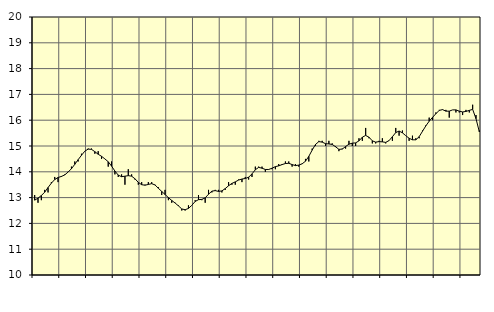
| Category | Piggar | Vård och omsorg, SNI 86-88 |
|---|---|---|
| nan | 13.1 | 12.9 |
| 87.0 | 12.8 | 12.98 |
| 87.0 | 12.9 | 13.08 |
| 87.0 | 13.3 | 13.21 |
| nan | 13.2 | 13.39 |
| 88.0 | 13.6 | 13.56 |
| 88.0 | 13.8 | 13.7 |
| 88.0 | 13.6 | 13.78 |
| nan | 13.8 | 13.82 |
| 89.0 | 13.9 | 13.88 |
| 89.0 | 14 | 13.99 |
| 89.0 | 14.2 | 14.12 |
| nan | 14.4 | 14.29 |
| 90.0 | 14.4 | 14.47 |
| 90.0 | 14.7 | 14.64 |
| 90.0 | 14.8 | 14.8 |
| nan | 14.9 | 14.88 |
| 91.0 | 14.9 | 14.87 |
| 91.0 | 14.7 | 14.78 |
| 91.0 | 14.8 | 14.68 |
| nan | 14.5 | 14.6 |
| 92.0 | 14.5 | 14.5 |
| 92.0 | 14.2 | 14.39 |
| 92.0 | 14.4 | 14.22 |
| nan | 13.9 | 14.03 |
| 93.0 | 13.8 | 13.87 |
| 93.0 | 13.9 | 13.81 |
| 93.0 | 13.5 | 13.83 |
| nan | 14.1 | 13.85 |
| 94.0 | 13.9 | 13.83 |
| 94.0 | 13.7 | 13.73 |
| 94.0 | 13.5 | 13.59 |
| nan | 13.6 | 13.5 |
| 95.0 | 13.5 | 13.48 |
| 95.0 | 13.6 | 13.51 |
| 95.0 | 13.6 | 13.54 |
| nan | 13.5 | 13.49 |
| 96.0 | 13.4 | 13.36 |
| 96.0 | 13.1 | 13.24 |
| 96.0 | 13.3 | 13.12 |
| nan | 12.9 | 13 |
| 97.0 | 12.8 | 12.89 |
| 97.0 | 12.8 | 12.79 |
| 97.0 | 12.7 | 12.68 |
| nan | 12.5 | 12.56 |
| 98.0 | 12.5 | 12.53 |
| 98.0 | 12.7 | 12.58 |
| 98.0 | 12.7 | 12.7 |
| nan | 12.9 | 12.85 |
| 99.0 | 13.1 | 12.92 |
| 99.0 | 12.9 | 12.93 |
| 99.0 | 12.8 | 12.99 |
| nan | 13.3 | 13.13 |
| 0.0 | 13.2 | 13.25 |
| 0.0 | 13.3 | 13.27 |
| 0.0 | 13.3 | 13.24 |
| nan | 13.2 | 13.26 |
| 1.0 | 13.3 | 13.35 |
| 1.0 | 13.6 | 13.46 |
| 1.0 | 13.5 | 13.55 |
| nan | 13.5 | 13.61 |
| 2.0 | 13.7 | 13.68 |
| 2.0 | 13.6 | 13.72 |
| 2.0 | 13.8 | 13.74 |
| nan | 13.7 | 13.79 |
| 3.0 | 13.8 | 13.92 |
| 3.0 | 14.2 | 14.08 |
| 3.0 | 14.2 | 14.17 |
| nan | 14.2 | 14.14 |
| 4.0 | 14 | 14.09 |
| 4.0 | 14.1 | 14.09 |
| 4.0 | 14.1 | 14.14 |
| nan | 14.1 | 14.2 |
| 5.0 | 14.3 | 14.23 |
| 5.0 | 14.3 | 14.28 |
| 5.0 | 14.4 | 14.32 |
| nan | 14.4 | 14.33 |
| 6.0 | 14.2 | 14.28 |
| 6.0 | 14.3 | 14.24 |
| 6.0 | 14.2 | 14.26 |
| nan | 14.3 | 14.31 |
| 7.0 | 14.5 | 14.41 |
| 7.0 | 14.4 | 14.6 |
| 7.0 | 14.9 | 14.84 |
| nan | 15 | 15.06 |
| 8.0 | 15.2 | 15.17 |
| 8.0 | 15.2 | 15.15 |
| 8.0 | 15 | 15.09 |
| nan | 15.2 | 15.08 |
| 9.0 | 15.1 | 15.06 |
| 9.0 | 15 | 14.97 |
| 9.0 | 14.8 | 14.87 |
| nan | 14.9 | 14.88 |
| 10.0 | 14.9 | 14.98 |
| 10.0 | 15.2 | 15.07 |
| 10.0 | 15 | 15.11 |
| nan | 15 | 15.12 |
| 11.0 | 15.3 | 15.2 |
| 11.0 | 15.2 | 15.34 |
| 11.0 | 15.7 | 15.41 |
| nan | 15.3 | 15.34 |
| 12.0 | 15.1 | 15.2 |
| 12.0 | 15.1 | 15.15 |
| 12.0 | 15.2 | 15.17 |
| nan | 15.3 | 15.16 |
| 13.0 | 15.1 | 15.14 |
| 13.0 | 15.2 | 15.21 |
| 13.0 | 15.2 | 15.36 |
| nan | 15.7 | 15.52 |
| 14.0 | 15.4 | 15.58 |
| 14.0 | 15.6 | 15.51 |
| 14.0 | 15.4 | 15.4 |
| nan | 15.2 | 15.3 |
| 15.0 | 15.4 | 15.24 |
| 15.0 | 15.3 | 15.24 |
| 15.0 | 15.3 | 15.36 |
| nan | 15.6 | 15.57 |
| 16.0 | 15.8 | 15.78 |
| 16.0 | 16.1 | 15.96 |
| 16.0 | 16 | 16.11 |
| nan | 16.3 | 16.25 |
| 17.0 | 16.4 | 16.38 |
| 17.0 | 16.4 | 16.41 |
| 17.0 | 16.4 | 16.35 |
| nan | 16.1 | 16.35 |
| 18.0 | 16.4 | 16.4 |
| 18.0 | 16.3 | 16.4 |
| 18.0 | 16.3 | 16.35 |
| nan | 16.2 | 16.32 |
| 19.0 | 16.4 | 16.34 |
| 19.0 | 16.3 | 16.38 |
| 19.0 | 16.6 | 16.42 |
| nan | 16.2 | 16.06 |
| 20.0 | 15.6 | 15.55 |